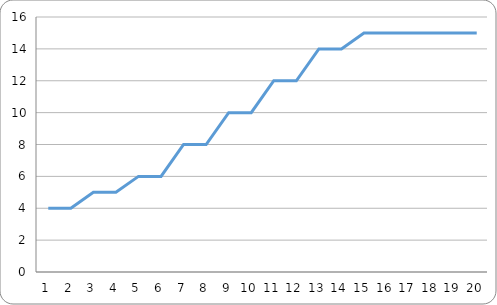
| Category | good |
|---|---|
| 0 | 4 |
| 1 | 4 |
| 2 | 5 |
| 3 | 5 |
| 4 | 6 |
| 5 | 6 |
| 6 | 8 |
| 7 | 8 |
| 8 | 10 |
| 9 | 10 |
| 10 | 12 |
| 11 | 12 |
| 12 | 14 |
| 13 | 14 |
| 14 | 15 |
| 15 | 15 |
| 16 | 15 |
| 17 | 15 |
| 18 | 15 |
| 19 | 15 |